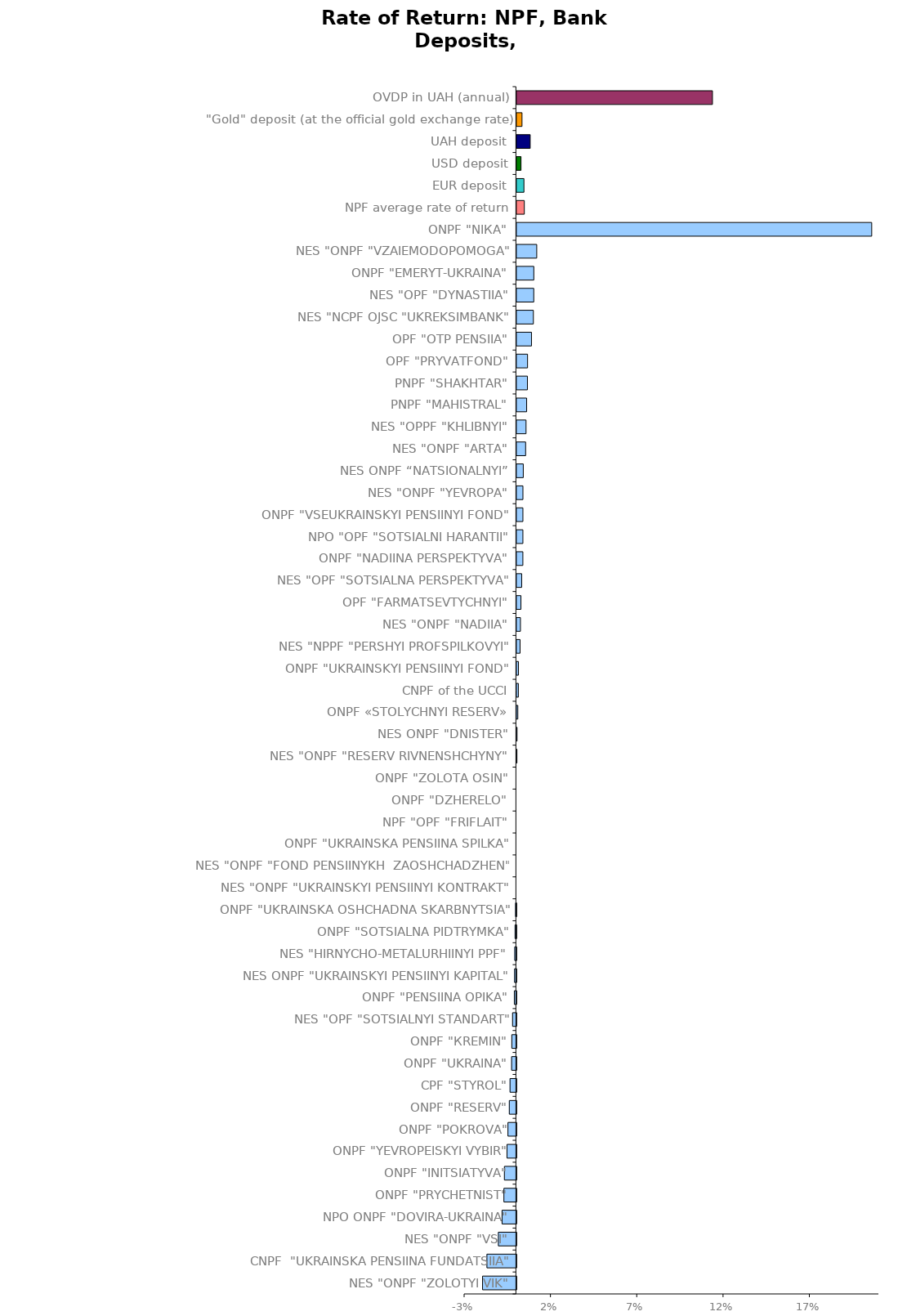
| Category | Series 0 |
|---|---|
| NES "ONPF "ZOLOTYI VIK" | -0.02 |
| CNPF  "UKRAINSKA PENSIINA FUNDATSIIA" | -0.017 |
| NES "ONPF "VSI" | -0.01 |
| NPO ONPF "DOVIRA-UKRAINA" | -0.008 |
| ONPF "PRYCHETNIST" | -0.007 |
| ONPF "INITSIATYVA" | -0.007 |
| ONPF "YEVROPEISKYI VYBIR" | -0.005 |
| ONPF "POKROVA" | -0.005 |
| ONPF "RESERV" | -0.004 |
| CPF "STYROL" | -0.004 |
| ONPF "UKRAINA" | -0.003 |
| ONPF "КREMIN" | -0.003 |
| NES "OPF "SOTSIALNYI STANDART" | -0.002 |
| ONPF "PENSIINA OPIKA" | -0.001 |
| NES ONPF "UKRAINSKYI PENSIINYI KAPITAL" | -0.001 |
| NES "HIRNYCHO-METALURHIINYI PPF" | -0.001 |
| ONPF "SOTSIALNA PIDTRYMKA" | -0.001 |
| ONPF "UKRAINSKA OSHCHADNA SKARBNYTSIA" | 0 |
| NES "ONPF "UKRAINSKYI PENSIINYI KONTRAKT" | 0 |
| NES "ONPF "FOND PENSIINYKH  ZAOSHCHADZHEN" | 0 |
| ONPF "UKRAINSKA PENSIINA SPILKA" | 0 |
| NPF "OPF "FRIFLAIT" | 0 |
| ONPF "DZHERELO" | 0 |
| ONPF "ZOLOTA OSIN" | 0 |
| NES "ONPF "RESERV RIVNENSHCHYNY" | 0 |
| NES ONPF "DNISTER" | 0 |
| ONPF «STOLYCHNYI RESERV» | 0.001 |
| CNPF of the UCCI | 0.001 |
| ONPF "UKRAINSKYI PENSIINYI FOND" | 0.001 |
| NES "NPPF "PERSHYI PROFSPILKOVYI" | 0.002 |
| NES "ONPF "NADIIA" | 0.002 |
| OPF "FARMATSEVTYCHNYI" | 0.002 |
| NES "OPF "SOTSIALNA PERSPEKTYVA" | 0.003 |
| ONPF "NADIINA PERSPEKTYVA" | 0.004 |
| NPO "OPF "SOTSIALNI HARANTII" | 0.004 |
| ONPF "VSEUKRAINSKYI PENSIINYI FOND" | 0.004 |
| NES "ONPF "YEVROPA" | 0.004 |
| NES ONPF “NATSIONALNYI” | 0.004 |
| NES "ONPF "АRТА" | 0.005 |
| NES "OPPF "KHLIBNYI" | 0.005 |
| PNPF "МAHISTRAL" | 0.006 |
| PNPF "SHAKHTAR" | 0.006 |
| OPF "PRYVATFOND" | 0.006 |
| OPF "ОТP PENSIIA" | 0.009 |
| NES "NCPF OJSC "UKREKSIMBANK" | 0.01 |
| NES "OPF "DYNASTIIA" | 0.01 |
| ONPF "ЕMERYT-UKRAINA" | 0.01 |
| NES "ONPF "VZAIEMODOPOMOGA" | 0.012 |
| ONPF "NIКА" | 0.206 |
| NPF average rate of return | 0.004 |
| EUR deposit | 0.004 |
| USD deposit | 0.002 |
| UAH deposit | 0.008 |
| "Gold" deposit (at the official gold exchange rate) | 0.003 |
| OVDP in UAH (annual) | 0.113 |